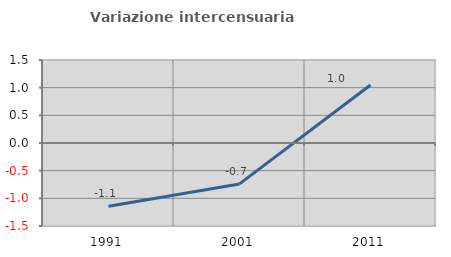
| Category | Variazione intercensuaria annua |
|---|---|
| 1991.0 | -1.143 |
| 2001.0 | -0.739 |
| 2011.0 | 1.048 |